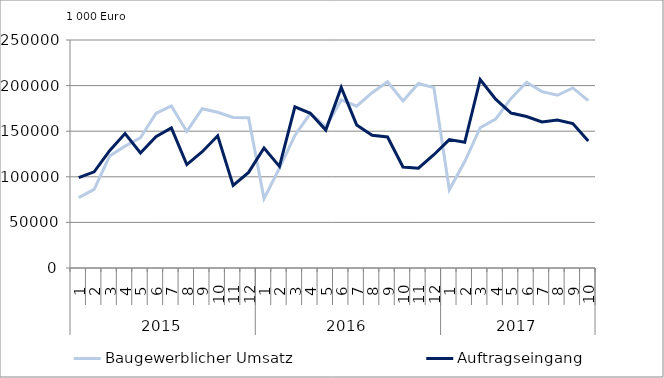
| Category | Baugewerblicher Umsatz | Auftragseingang |
|---|---|---|
| 0 | 77137.228 | 99023.008 |
| 1 | 86257.027 | 105491.844 |
| 2 | 122760.234 | 128704.324 |
| 3 | 133614.814 | 147438.665 |
| 4 | 142869.83 | 126182.175 |
| 5 | 169564.381 | 143879.815 |
| 6 | 177708.819 | 153660.001 |
| 7 | 149762.789 | 113338.261 |
| 8 | 174633.481 | 127520.775 |
| 9 | 170827.145 | 144931.886 |
| 10 | 165122.384 | 90621.16 |
| 11 | 164674.971 | 104795.622 |
| 12 | 76043.538 | 131571.482 |
| 13 | 109483.268 | 111467.248 |
| 14 | 145343.559 | 176673.268 |
| 15 | 169660.551 | 169566.96 |
| 16 | 154554.865 | 151228.165 |
| 17 | 184236.137 | 198035.655 |
| 18 | 177444.278 | 156900.898 |
| 19 | 192230.472 | 145537.167 |
| 20 | 204178.065 | 143616.217 |
| 21 | 183173.849 | 110770.94 |
| 22 | 202302.279 | 109384.188 |
| 23 | 197832.096 | 124193.91 |
| 24 | 85701.947 | 140751.008 |
| 25 | 116743.276 | 137863.383 |
| 26 | 153810.055 | 206710.579 |
| 27 | 163342.989 | 185183.797 |
| 28 | 185946.221 | 169878.51 |
| 29 | 203627.91 | 166148.392 |
| 30 | 193377.256 | 160134.206 |
| 31 | 189429.952 | 162221.206 |
| 32 | 197405.279 | 158305.285 |
| 33 | 183450.026 | 139156.761 |